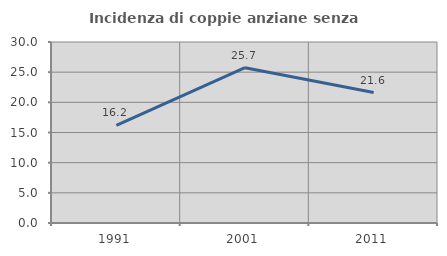
| Category | Incidenza di coppie anziane senza figli  |
|---|---|
| 1991.0 | 16.189 |
| 2001.0 | 25.734 |
| 2011.0 | 21.622 |